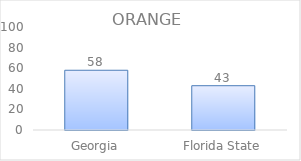
| Category | Series 0 |
|---|---|
| Georgia | 58 |
| Florida State | 43 |